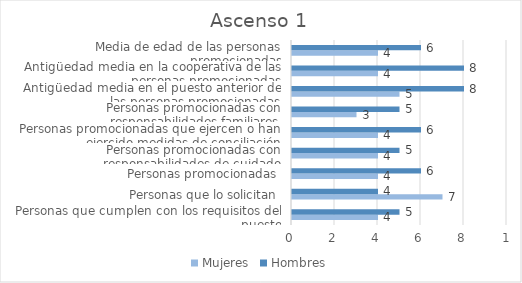
| Category | Mujeres | Hombres |
|---|---|---|
| Personas que cumplen con los requisitos del puesto | 4 | 5 |
| Personas que lo solicitan | 7 | 4 |
| Personas promocionadas | 4 | 6 |
| Personas promocionadas con responsabilidades de cuidado | 4 | 5 |
| Personas promocionadas que ejercen o han ejercido medidas de conciliación | 4 | 6 |
| Personas promocionadas con responsabilidades familiares | 3 | 5 |
| Antigüedad media en el puesto anterior de las personas promocionadas | 5 | 8 |
| Antigüedad media en la cooperativa de las personas promocionadas | 4 | 8 |
| Media de edad de las personas promocionadas | 4 | 6 |